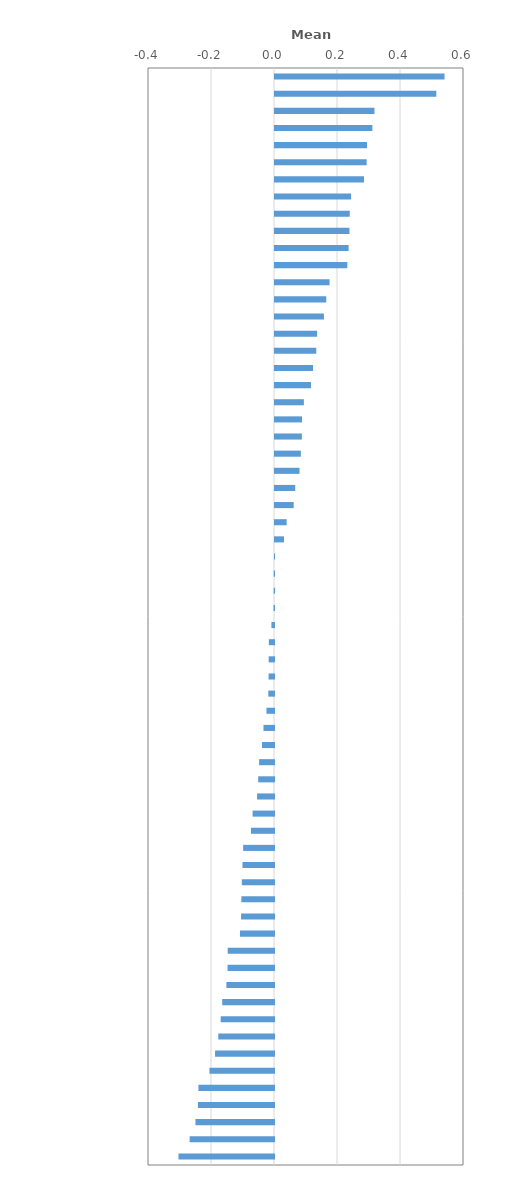
| Category | Global mindedness mean index |
|---|---|
| Albania | 0.538 |
| Korea | 0.512 |
| Portugal | 0.316 |
| Singapore | 0.309 |
| Costa Rica | 0.292 |
| Chinese Taipei | 0.291 |
| Turkey | 0.282 |
| Baku (Azerbaijan) | 0.242 |
| Jordan | 0.237 |
| Spain | 0.236 |
| Kosovo | 0.234 |
| Malta | 0.23 |
| Colombia | 0.173 |
| Canada | 0.163 |
| North Macedonia | 0.155 |
| Philippines | 0.134 |
| Hong Kong (China) | 0.131 |
| Peru | 0.121 |
| Mexico | 0.114 |
| Lebanon | 0.092 |
| Lithuania | 0.086 |
| Australia | 0.085 |
| Thailand | 0.082 |
| New Zealand | 0.078 |
| Dominican Republic | 0.064 |
| Greece | 0.059 |
| Panama | 0.037 |
| Brunei Darussalam | 0.029 |
| Ireland | 0 |
| Croatia | -0.001 |
| Macao (China) | -0.001 |
| OECD average | -0.002 |
| Malaysia | -0.008 |
| Kazakhstan | -0.016 |
| Indonesia | -0.017 |
| Iceland | -0.017 |
| Saudi Arabia | -0.018 |
| Chile | -0.024 |
| Montenegro | -0.033 |
| Brazil | -0.038 |
| France | -0.047 |
| Argentina | -0.05 |
| Scotland (United Kingdom) | -0.054 |
| Uruguay | -0.068 |
| Bulgaria | -0.073 |
| Slovenia | -0.098 |
| Belarus | -0.1 |
| Morocco | -0.102 |
| Moldova | -0.104 |
| Italy | -0.105 |
| Bosnia and Herzegovina | -0.108 |
| Serbia | -0.147 |
| Romania | -0.147 |
| Viet Nam | -0.151 |
| Ukraine | -0.164 |
| Poland | -0.169 |
| Switzerland | -0.177 |
| Estonia | -0.187 |
| Austria | -0.205 |
| Russia | -0.24 |
| Latvia | -0.242 |
| Hungary | -0.249 |
| Germany | -0.268 |
| Slovak Republic | -0.303 |